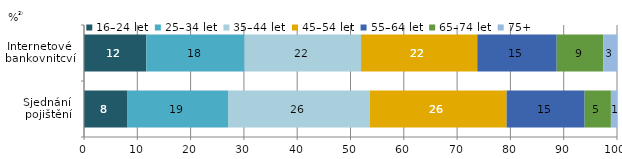
| Category | 16–24 let | 25–34 let | 35–44 let | 45–54 let | 55–64 let | 65–74 let | 75+ |
|---|---|---|---|---|---|---|---|
| Sjednání 
pojištění | 8.176 | 18.94 | 26.465 | 25.71 | 14.637 | 4.929 | 1.143 |
| Internetové 
bankovnitcví | 11.71 | 18.423 | 21.845 | 21.81 | 14.898 | 8.772 | 2.542 |